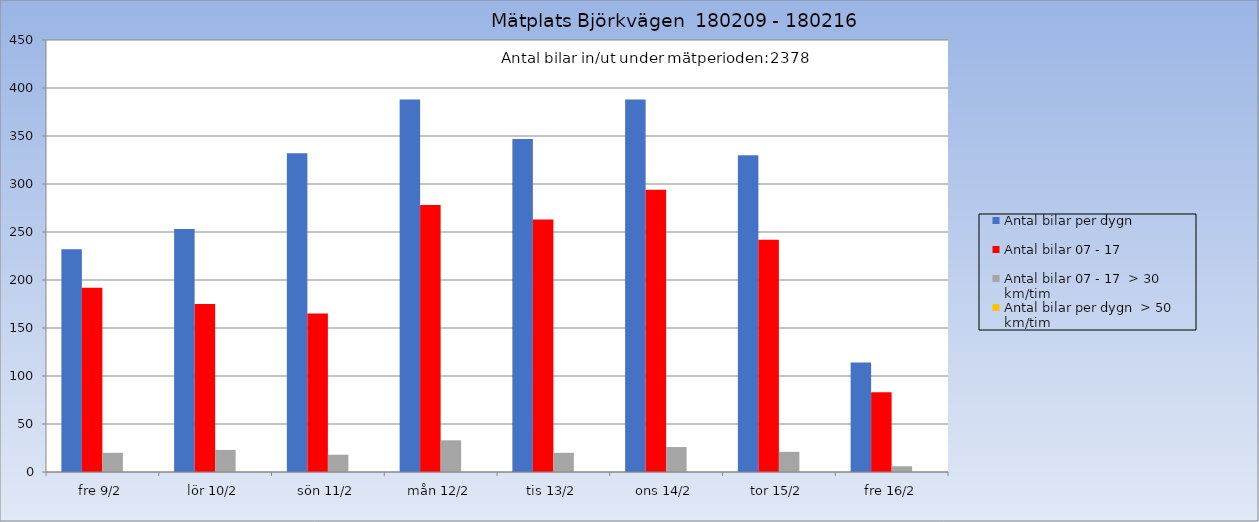
| Category | Antal bilar per dygn | Antal bilar 07 - 17 | Antal bilar 07 - 17  > 30 km/tim | Antal bilar per dygn  > 50 km/tim |
|---|---|---|---|---|
| fre 9/2 | 232 | 192 | 20 | 0 |
| lör 10/2 | 253 | 175 | 23 | 0 |
| sön 11/2 | 332 | 165 | 18 | 0 |
| mån 12/2 | 388 | 278 | 33 | 0 |
| tis 13/2 | 347 | 263 | 20 | 0 |
| ons 14/2 | 388 | 294 | 26 | 0 |
| tor 15/2 | 330 | 242 | 21 | 0 |
| fre 16/2 | 114 | 83 | 6 | 0 |